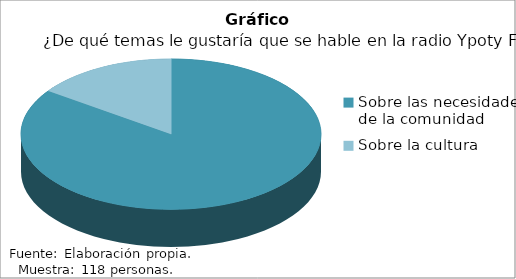
| Category | Series 0 |
|---|---|
| Sobre las necesidades de la comunidad | 100 |
| Sobre la cultura | 18 |